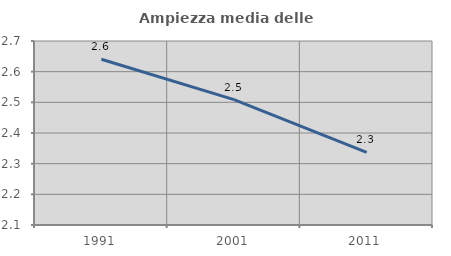
| Category | Ampiezza media delle famiglie |
|---|---|
| 1991.0 | 2.64 |
| 2001.0 | 2.509 |
| 2011.0 | 2.337 |